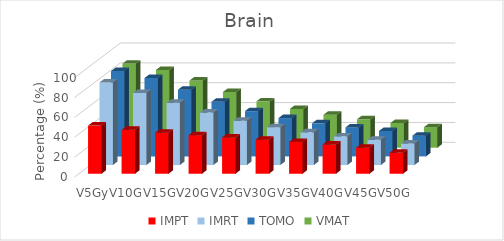
| Category | IMPT | IMRT | TOMO | VMAT |
|---|---|---|---|---|
| V5Gy | 48.5 | 83.2 | 85.9 | 84.7 |
| V10Gy | 44.2 | 72.6 | 78.9 | 78.3 |
| V15Gy | 41.3 | 62.7 | 67.2 | 67.6 |
| V20Gy | 38.8 | 52.9 | 55 | 56.1 |
| V25Gy | 36.6 | 44.7 | 45.6 | 46.7 |
| V30Gy | 34.3 | 38.2 | 38.6 | 39.1 |
| V35Gy | 31.9 | 33 | 33.3 | 33.2 |
| V40Gy | 29.4 | 28.9 | 29.2 | 28.6 |
| V45Gy | 26.2 | 25.6 | 25.6 | 24.9 |
| V50Gy | 21.1 | 21.8 | 20.9 | 20.7 |